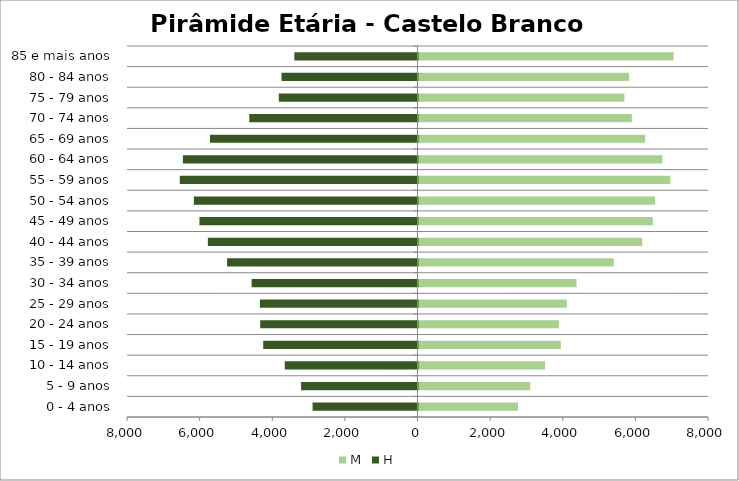
| Category | M | H |
|---|---|---|
| 0 - 4 anos | 2739 | -2889 |
| 5 - 9 anos | 3078 | -3206 |
| 10 - 14 anos | 3486 | -3656 |
| 15 - 19 anos | 3920 | -4249 |
| 20 - 24 anos | 3868 | -4333 |
| 25 - 29 anos | 4086 | -4340 |
| 30 - 34 anos | 4353 | -4568 |
| 35 - 39 anos | 5377 | -5244 |
| 40 - 44 anos | 6161 | -5773 |
| 45 - 49 anos | 6454 | -6005 |
| 50 - 54 anos | 6516 | -6159 |
| 55 - 59 anos | 6938 | -6547 |
| 60 - 64 anos | 6716 | -6461 |
| 65 - 69 anos | 6242 | -5715 |
| 70 - 74 anos | 5875 | -4633 |
| 75 - 79 anos | 5669 | -3820 |
| 80 - 84 anos | 5801 | -3745 |
| 85 e mais anos | 7024 | -3392 |